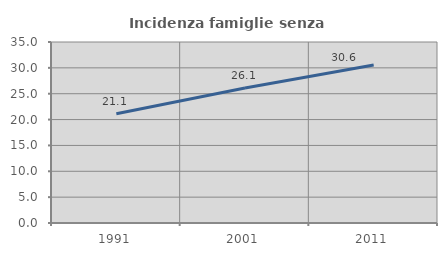
| Category | Incidenza famiglie senza nuclei |
|---|---|
| 1991.0 | 21.133 |
| 2001.0 | 26.121 |
| 2011.0 | 30.562 |